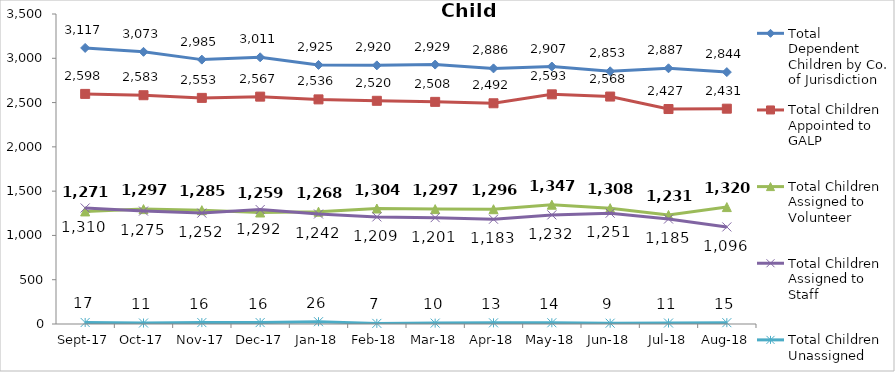
| Category | Total Dependent Children by Co. of Jurisdiction | Total Children Appointed to GALP | Total Children Assigned to Volunteer | Total Children Assigned to Staff | Total Children Unassigned |
|---|---|---|---|---|---|
| 2017-09-01 | 3117 | 2598 | 1271 | 1310 | 17 |
| 2017-10-01 | 3073 | 2583 | 1297 | 1275 | 11 |
| 2017-11-01 | 2985 | 2553 | 1285 | 1252 | 16 |
| 2017-12-01 | 3011 | 2567 | 1259 | 1292 | 16 |
| 2018-01-01 | 2925 | 2536 | 1268 | 1242 | 26 |
| 2018-02-01 | 2920 | 2520 | 1304 | 1209 | 7 |
| 2018-03-01 | 2929 | 2508 | 1297 | 1201 | 10 |
| 2018-04-01 | 2886 | 2492 | 1296 | 1183 | 13 |
| 2018-05-01 | 2907 | 2593 | 1347 | 1232 | 14 |
| 2018-06-01 | 2853 | 2568 | 1308 | 1251 | 9 |
| 2018-07-01 | 2887 | 2427 | 1231 | 1185 | 11 |
| 2018-08-01 | 2844 | 2431 | 1320 | 1096 | 15 |